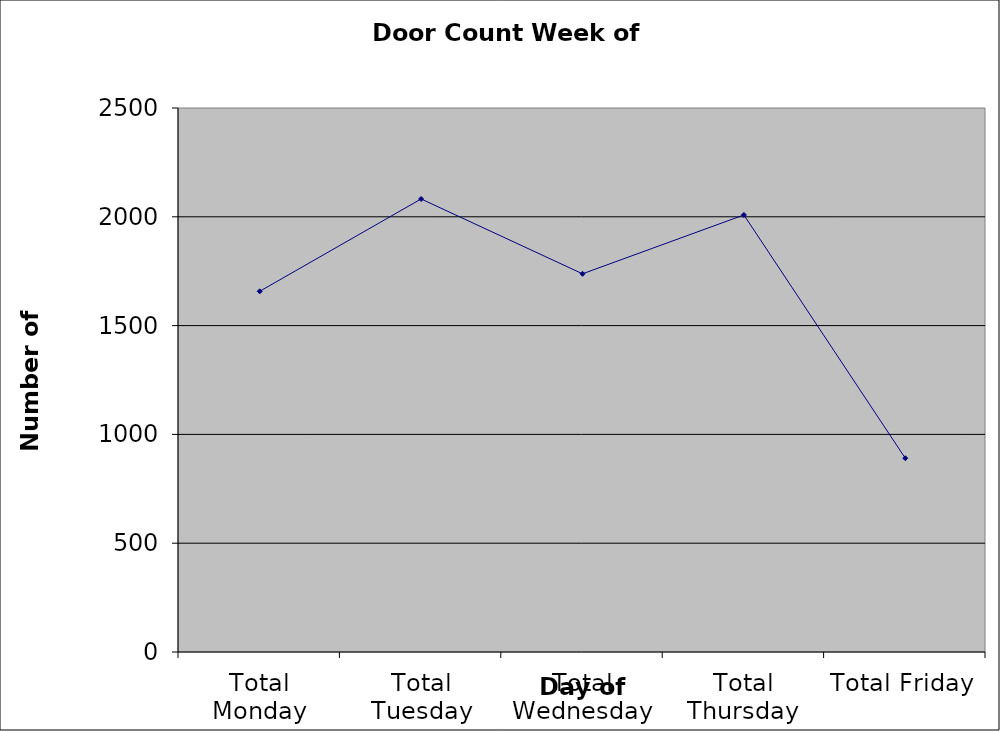
| Category | Series 0 |
|---|---|
| Total Monday | 1657.5 |
| Total Tuesday | 2082 |
| Total Wednesday | 1738 |
| Total Thursday | 2008.5 |
| Total Friday | 890.5 |